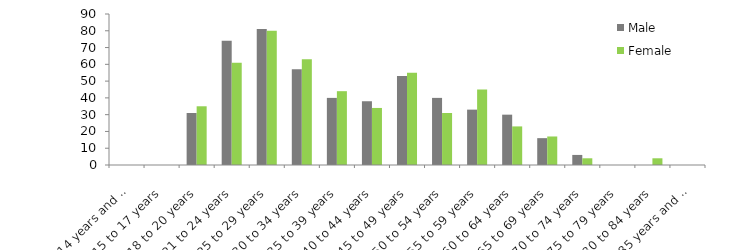
| Category | Male | Female |
|---|---|---|
| 14 years and under | 0 | 0 |
| 15 to 17 years | 0 | 0 |
| 18 to 20 years | 31 | 35 |
| 21 to 24 years | 74 | 61 |
| 25 to 29 years | 81 | 80 |
| 30 to 34 years | 57 | 63 |
| 35 to 39 years | 40 | 44 |
| 40 to 44 years | 38 | 34 |
| 45 to 49 years | 53 | 55 |
| 50 to 54 years | 40 | 31 |
| 55 to 59 years | 33 | 45 |
| 60 to 64 years | 30 | 23 |
| 65 to 69 years | 16 | 17 |
| 70 to 74 years | 6 | 4 |
| 75 to 79 years | 0 | 0 |
| 80 to 84 years | 0 | 4 |
| 85 years and over | 0 | 0 |